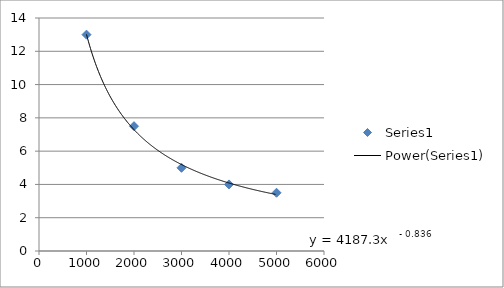
| Category | Series 0 |
|---|---|
| 1000.0 | 13 |
| 2000.0 | 7.5 |
| 3000.0 | 5 |
| 4000.0 | 4 |
| 5000.0 | 3.5 |